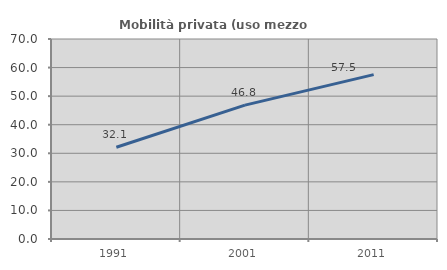
| Category | Mobilità privata (uso mezzo privato) |
|---|---|
| 1991.0 | 32.13 |
| 2001.0 | 46.847 |
| 2011.0 | 57.521 |